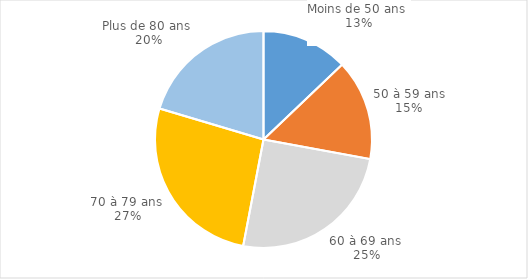
| Category | Series 0 |
|---|---|
| Moins de 50 ans  | 0.129 |
| 50 à 59 ans | 0.15 |
| 60 à 69 ans  | 0.251 |
| 70 à 79 ans  | 0.266 |
| Plus de 80 ans  | 0.204 |